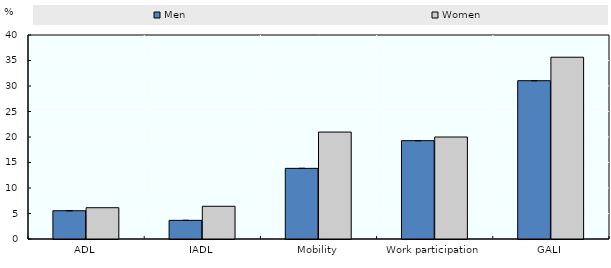
| Category | Men | Women |
|---|---|---|
| ADL | 5.543 | 6.135 |
| IADL | 3.653 | 6.416 |
| Mobility | 13.849 | 20.968 |
| Work participation | 19.281 | 19.999 |
| GALI | 31.041 | 35.64 |